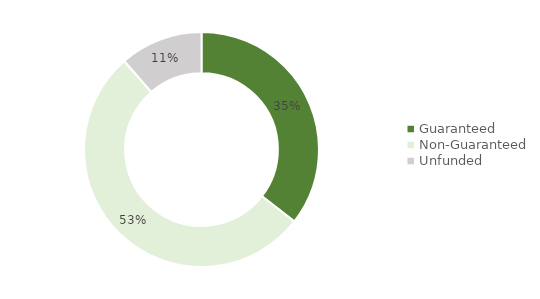
| Category | Series 0 |
|---|---|
| Guaranteed | 0.355 |
| Non-Guaranteed | 0.531 |
| Unfunded | 0.114 |